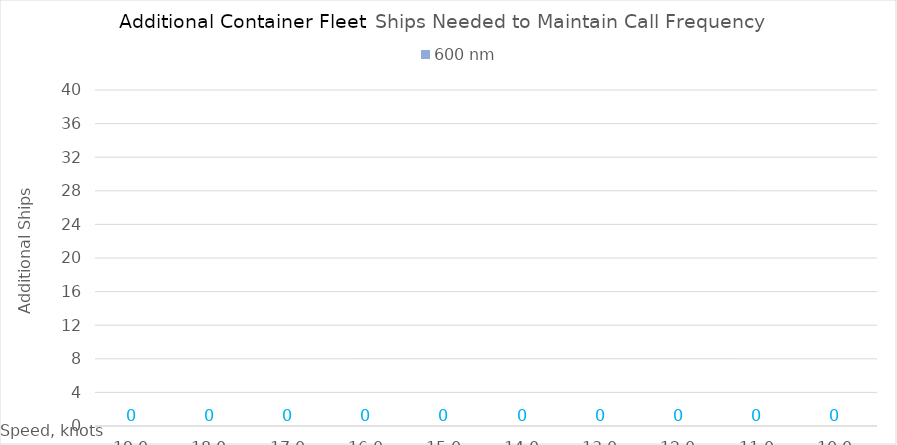
| Category | 600 |
|---|---|
| 19.0 | 0 |
| 18.0 | 0 |
| 17.0 | 0 |
| 16.0 | 0 |
| 15.0 | 0 |
| 14.0 | 0 |
| 13.0 | 0 |
| 12.0 | 0 |
| 11.0 | 0 |
| 10.0 | 0 |